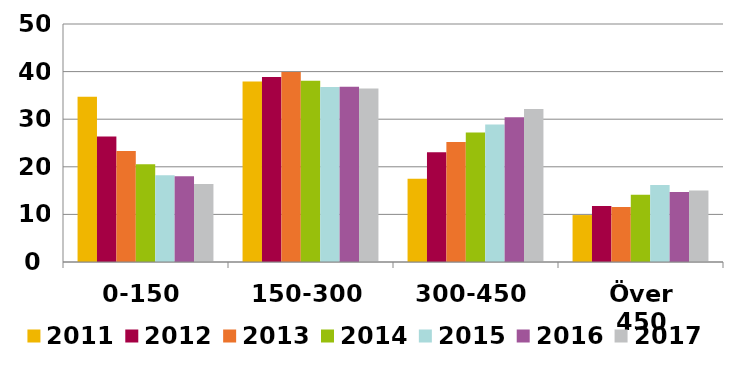
| Category | 2011 | 2012 | 2013 | 2014 | 2015 | 2016 | 2017 |
|---|---|---|---|---|---|---|---|
| 0-150 | 34.71 | 26.35 | 23.34 | 20.56 | 18.2 | 18 | 16.41 |
| 150-300 | 37.93 | 38.84 | 39.91 | 38.07 | 36.75 | 36.84 | 36.44 |
| 300-450 | 17.5 | 23.05 | 25.22 | 27.23 | 28.89 | 30.43 | 32.14 |
| Över 450 | 9.86 | 11.76 | 11.53 | 14.14 | 16.16 | 14.73 | 15.01 |